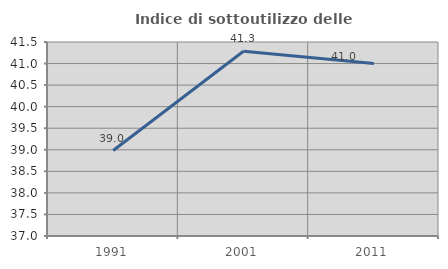
| Category | Indice di sottoutilizzo delle abitazioni  |
|---|---|
| 1991.0 | 38.983 |
| 2001.0 | 41.284 |
| 2011.0 | 41 |